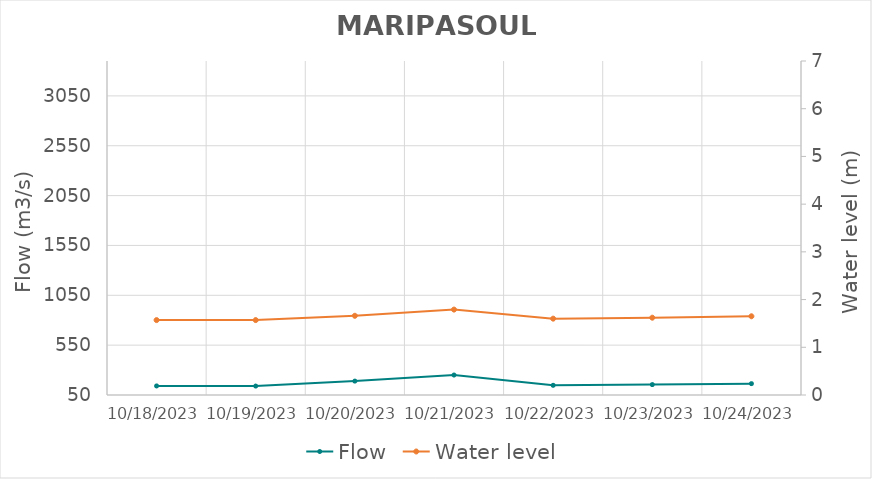
| Category | Flow |
|---|---|
| 7/20/23 | 745.5 |
| 7/19/23 | 758.69 |
| 7/18/23 | 753.58 |
| 7/17/23 | 740.46 |
| 7/16/23 | 719.11 |
| 7/15/23 | 744.75 |
| 7/14/23 | 756.85 |